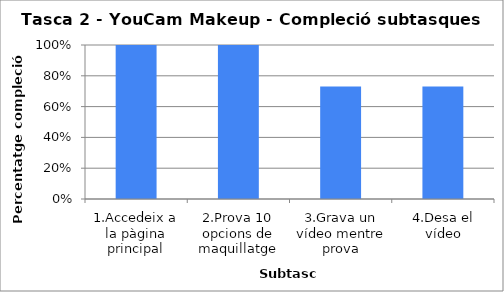
| Category | Series 0 |
|---|---|
| 1.Accedeix a la pàgina principal | 1 |
| 2.Prova 10 opcions de maquillatge | 1 |
| 3.Grava un vídeo mentre prova | 0.73 |
| 4.Desa el vídeo | 0.73 |